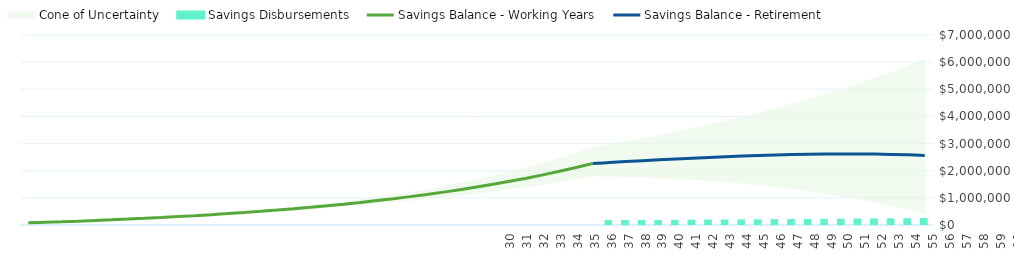
| Category |  Savings Disbursements |
|---|---|
| 0 | 0 |
| 1 | 0 |
| 2 | 0 |
| 3 | 0 |
| 4 | 0 |
| 5 | 0 |
| 6 | 0 |
| 7 | 0 |
| 8 | 0 |
| 9 | 0 |
| 10 | 0 |
| 11 | 0 |
| 12 | 0 |
| 13 | 0 |
| 14 | 0 |
| 15 | 0 |
| 16 | 0 |
| 17 | 0 |
| 18 | 0 |
| 19 | 0 |
| 20 | 0 |
| 21 | 0 |
| 22 | 0 |
| 23 | 0 |
| 24 | 0 |
| 25 | 0 |
| 26 | 0 |
| 27 | 0 |
| 28 | 0 |
| 29 | 0 |
| 30 | 0 |
| 31 | 0 |
| 32 | 0 |
| 33 | 0 |
| 34 | 0 |
| 35 | 105519.842 |
| 36 | 108685.437 |
| 37 | 111946 |
| 38 | 115304.38 |
| 39 | 118763.512 |
| 40 | 122326.417 |
| 41 | 125996.21 |
| 42 | 129776.096 |
| 43 | 133669.379 |
| 44 | 137679.46 |
| 45 | 141809.844 |
| 46 | 146064.139 |
| 47 | 150446.064 |
| 48 | 154959.445 |
| 49 | 159608.229 |
| 50 | 164396.476 |
| 51 | 169328.37 |
| 52 | 174408.221 |
| 53 | 179640.468 |
| 54 | 185029.682 |